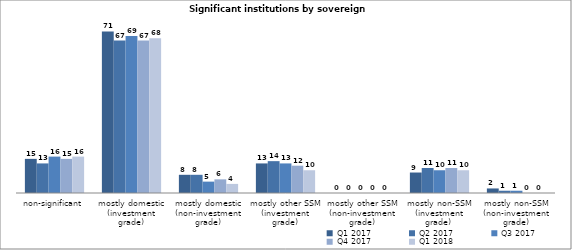
| Category | Q1 2017 | Q2 2017 | Q3 2017 | Q4 2017 | Q1 2018 |
|---|---|---|---|---|---|
| non-significant | 15 | 13 | 16 | 15 | 16 |
| mostly domestic
(investment grade) | 71 | 67 | 69 | 67 | 68 |
| mostly domestic
(non-investment grade) | 8 | 8 | 5 | 6 | 4 |
| mostly other SSM
(investment grade) | 13 | 14 | 13 | 12 | 10 |
| mostly other SSM
(non-investment grade) | 0 | 0 | 0 | 0 | 0 |
| mostly non-SSM
(investment grade)  | 9 | 11 | 10 | 11 | 10 |
| mostly non-SSM
(non-investment grade) | 2 | 1 | 1 | 0 | 0 |